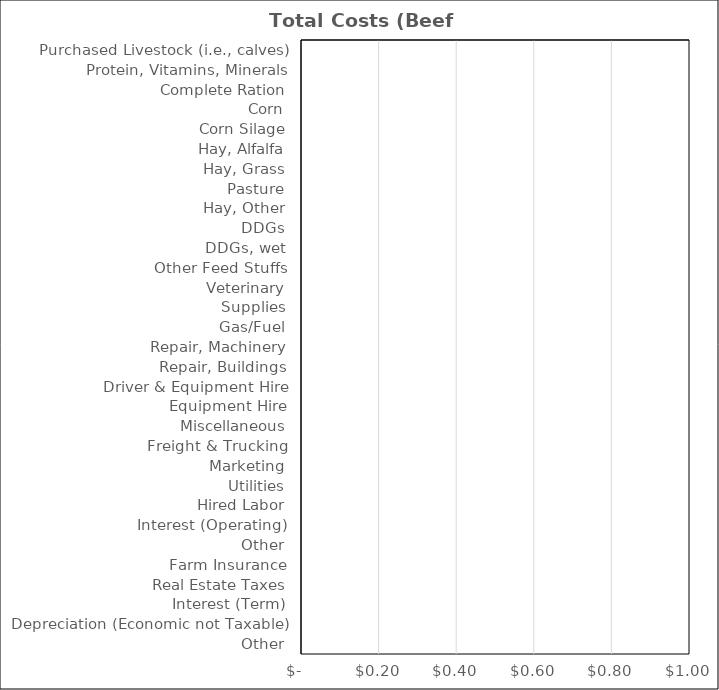
| Category | Beef Backgrounding |
|---|---|
| Purchased Livestock (i.e., calves) | 0 |
| Protein, Vitamins, Minerals | 0 |
| Complete Ration | 0 |
| Corn | 0 |
| Corn Silage | 0 |
| Hay, Alfalfa | 0 |
| Hay, Grass | 0 |
| Pasture | 0 |
| Hay, Other | 0 |
| DDGs | 0 |
| DDGs, wet | 0 |
| Other Feed Stuffs | 0 |
| Veterinary | 0 |
| Supplies | 0 |
| Gas/Fuel | 0 |
| Repair, Machinery | 0 |
| Repair, Buildings | 0 |
| Driver & Equipment Hire | 0 |
| Equipment Hire | 0 |
| Miscellaneous | 0 |
| Freight & Trucking | 0 |
| Marketing | 0 |
| Utilities | 0 |
| Hired Labor | 0 |
| Interest (Operating) | 0 |
| Other | 0 |
| Farm Insurance | 0 |
| Real Estate Taxes | 0 |
| Interest (Term) | 0 |
| Depreciation (Economic not Taxable) | 0 |
| Other | 0 |